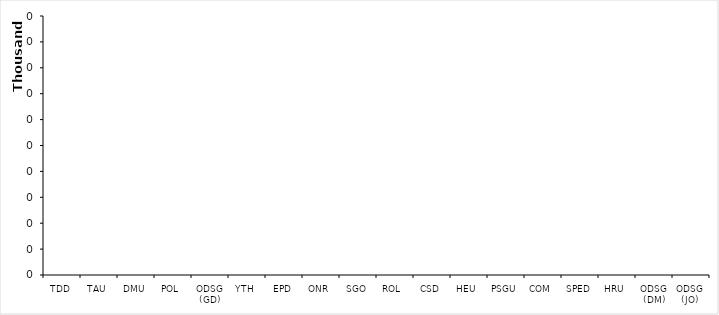
| Category | Series 0 |
|---|---|
| TDD | 0 |
| TAU | 0 |
| DMU | 0 |
| POL | 0 |
| ODSG (GD) | 0 |
| YTH | 0 |
| EPD | 0 |
| ONR | 0 |
| SGO | 0 |
| ROL | 0 |
| CSD | 0 |
| HEU | 0 |
| PSGU | 0 |
| COM | 0 |
| SPED | 0 |
| HRU | 0 |
| ODSG (DM) | 0 |
| ODSG (JO) | 0 |